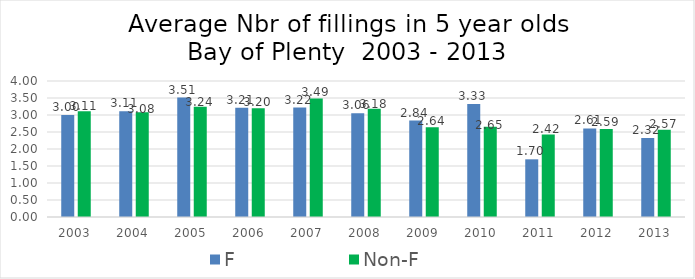
| Category | F | Non-F |
|---|---|---|
| 2003.0 | 3 | 3.11 |
| 2004.0 | 3.11 | 3.08 |
| 2005.0 | 3.513 | 3.24 |
| 2006.0 | 3.21 | 3.2 |
| 2007.0 | 3.218 | 3.488 |
| 2008.0 | 3.055 | 3.182 |
| 2009.0 | 2.837 | 2.64 |
| 2010.0 | 3.325 | 2.655 |
| 2011.0 | 1.696 | 2.423 |
| 2012.0 | 2.606 | 2.591 |
| 2013.0 | 2.32 | 2.568 |